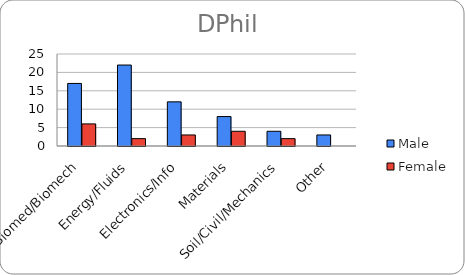
| Category | Male | Female |
|---|---|---|
| Biomed/Biomech | 17 | 6 |
| Energy/Fluids | 22 | 2 |
| Electronics/Info | 12 | 3 |
| Materials | 8 | 4 |
| Soil/Civil/Mechanics | 4 | 2 |
| Other | 3 | 0 |